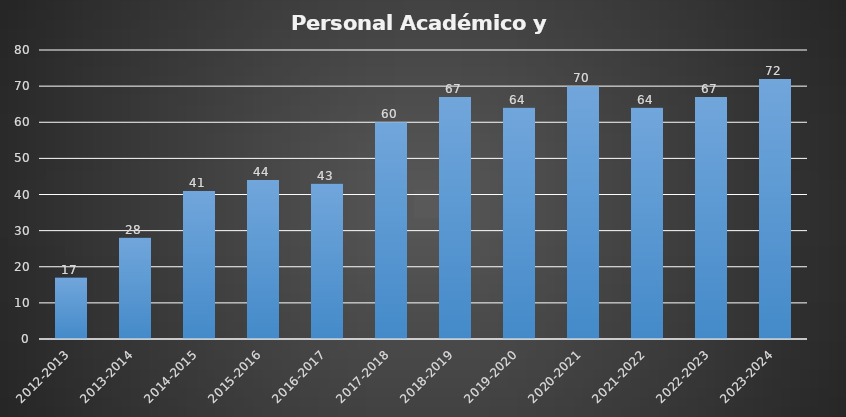
| Category | Series 0 |
|---|---|
| 2012-2013 | 17 |
| 2013-2014 | 28 |
| 2014-2015 | 41 |
| 2015-2016 | 44 |
| 2016-2017 | 43 |
| 2017-2018 | 60 |
| 2018-2019 | 67 |
| 2019-2020 | 64 |
| 2020-2021 | 70 |
| 2021-2022 | 64 |
| 2022-2023 | 67 |
| 2023-2024 | 72 |